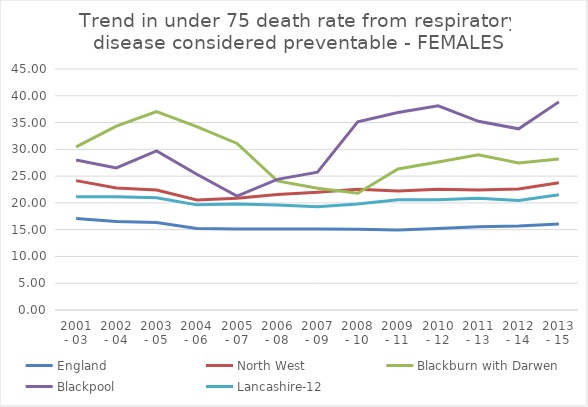
| Category | England | North West | Blackburn with Darwen | Blackpool | Lancashire-12 |
|---|---|---|---|---|---|
| 2001 - 03 | 17.069 | 24.157 | 30.447 | 28.003 | 21.158 |
| 2002 - 04 | 16.536 | 22.781 | 34.332 | 26.543 | 21.167 |
| 2003 - 05 | 16.334 | 22.402 | 37.047 | 29.717 | 20.951 |
| 2004 - 06 | 15.206 | 20.549 | 34.253 | 25.345 | 19.632 |
| 2005 - 07 | 15.144 | 20.857 | 31.095 | 21.281 | 19.773 |
| 2006 - 08 | 15.127 | 21.566 | 24.094 | 24.391 | 19.596 |
| 2007 - 09 | 15.106 | 21.974 | 22.725 | 25.726 | 19.299 |
| 2008 - 10 | 15.084 | 22.541 | 21.804 | 35.141 | 19.772 |
| 2009 - 11 | 14.943 | 22.209 | 26.322 | 36.887 | 20.601 |
| 2010 - 12 | 15.219 | 22.558 | 27.63 | 38.138 | 20.572 |
| 2011 - 13 | 15.531 | 22.399 | 28.991 | 35.237 | 20.847 |
| 2012 - 14 | 15.686 | 22.608 | 27.469 | 33.831 | 20.445 |
| 2013 - 15 | 16.073 | 23.747 | 28.178 | 38.862 | 21.516 |